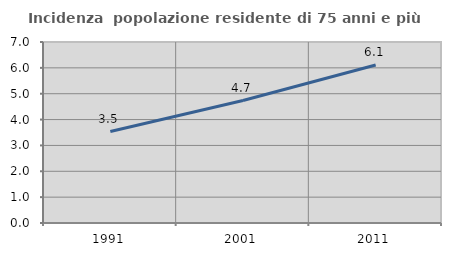
| Category | Incidenza  popolazione residente di 75 anni e più |
|---|---|
| 1991.0 | 3.537 |
| 2001.0 | 4.736 |
| 2011.0 | 6.112 |